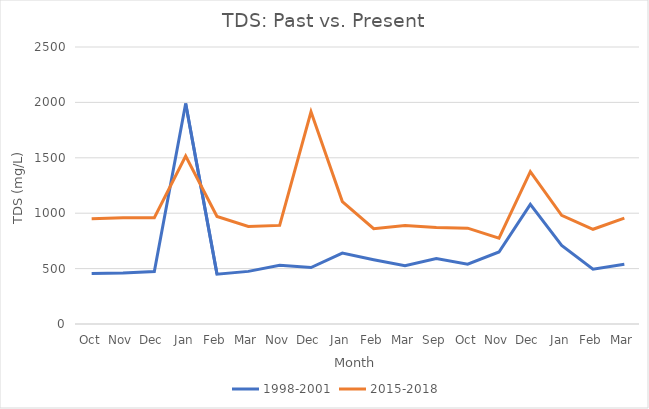
| Category | 1998-2001 | 2015-2018 |
|---|---|---|
| Oct | 455 | 950 |
| Nov | 460 | 960 |
| Dec | 474 | 960 |
| Jan | 1990 | 1515 |
| Feb | 450 | 970 |
| Mar | 475 | 880 |
| Nov | 530 | 890 |
| Dec | 510 | 1915 |
| Jan | 640 | 1105 |
| Feb | 580 | 860 |
| Mar | 525 | 890 |
| Sep | 590 | 870 |
| Oct | 540 | 865 |
| Nov | 650 | 775 |
| Dec | 1080 | 1375 |
| Jan | 710 | 980 |
| Feb | 495 | 855 |
| Mar | 540 | 955 |